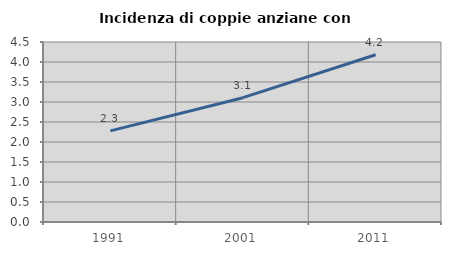
| Category | Incidenza di coppie anziane con figli |
|---|---|
| 1991.0 | 2.278 |
| 2001.0 | 3.108 |
| 2011.0 | 4.182 |